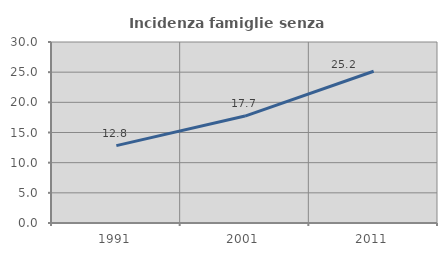
| Category | Incidenza famiglie senza nuclei |
|---|---|
| 1991.0 | 12.82 |
| 2001.0 | 17.724 |
| 2011.0 | 25.151 |